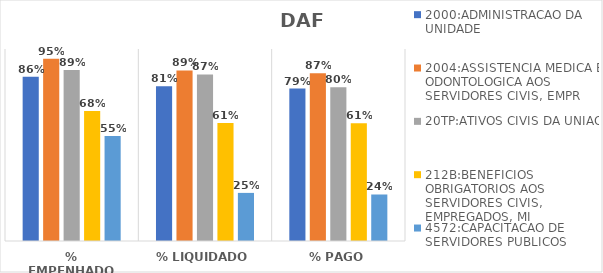
| Category | 2000:ADMINISTRACAO DA UNIDADE | 2004:ASSISTENCIA MEDICA E ODONTOLOGICA AOS SERVIDORES CIVIS, EMPR | 20TP:ATIVOS CIVIS DA UNIAO | 212B:BENEFICIOS OBRIGATORIOS AOS SERVIDORES CIVIS, EMPREGADOS, MI | 4572:CAPACITACAO DE SERVIDORES PUBLICOS FEDERAIS EM PROCESSO DE Q |
|---|---|---|---|---|---|
| % EMPENHADO | 0.856 | 0.949 | 0.89 | 0.677 | 0.547 |
| % LIQUIDADO | 0.806 | 0.889 | 0.868 | 0.615 | 0.251 |
| % PAGO | 0.794 | 0.874 | 0.8 | 0.613 | 0.242 |